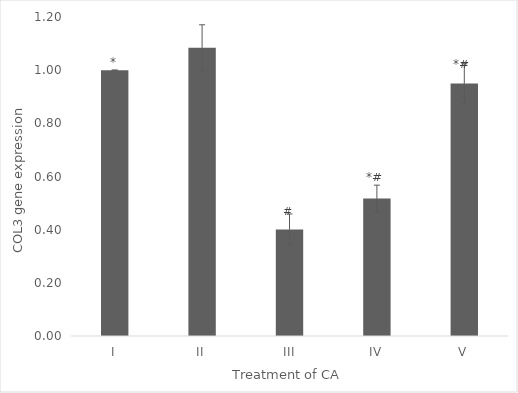
| Category | Series 0 |
|---|---|
| I | 1 |
| II | 1.084 |
| III | 0.401 |
| IV | 0.517 |
| V | 0.95 |